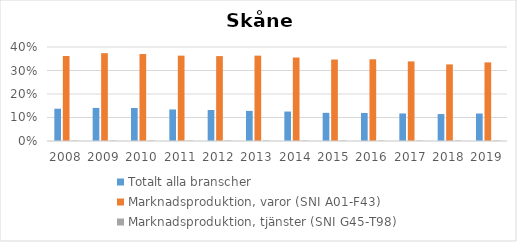
| Category | Totalt alla branscher | Marknadsproduktion, varor (SNI A01-F43) | Marknadsproduktion, tjänster (SNI G45-T98) |
|---|---|---|---|
| 2008 | 0.137 | 0.362 | 0.002 |
| 2009 | 0.141 | 0.374 | 0.002 |
| 2010 | 0.141 | 0.37 | 0.002 |
| 2011 | 0.134 | 0.363 | 0.002 |
| 2012 | 0.132 | 0.361 | 0.002 |
| 2013 | 0.128 | 0.363 | 0.002 |
| 2014 | 0.125 | 0.355 | 0.002 |
| 2015 | 0.12 | 0.347 | 0.002 |
| 2016 | 0.119 | 0.348 | 0.002 |
| 2017 | 0.117 | 0.339 | 0.002 |
| 2018 | 0.115 | 0.326 | 0.002 |
| 2019 | 0.117 | 0.335 | 0.002 |